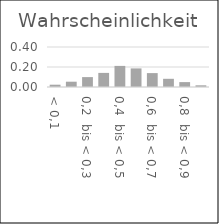
| Category | Wahrschein-lichkeit |
|---|---|
| < 0,1 | 0.023 |
| 0,1  bis < 0,2 | 0.053 |
| 0,2  bis < 0,3 | 0.099 |
| 0,3  bis < 0,4 | 0.141 |
| 0,4  bis < 0,5 | 0.211 |
| 0,5  bis < 0,6 | 0.186 |
| 0,6  bis < 0,7 | 0.139 |
| 0,7  bis < 0,8 | 0.082 |
| 0,8  bis < 0,9 | 0.049 |
| > 0,9 | 0.017 |